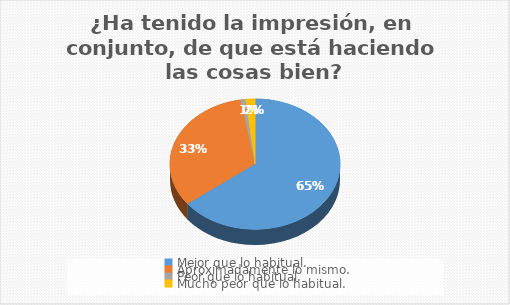
| Category | ¿Ha tenido la impresión, en conjunto, de que está haciendo las cosas bien? |
|---|---|
| Mejor que lo habitual. | 71 |
| Aproximadamente lo mismo. | 36 |
| Peor que lo habitual. | 1 |
| Mucho peor que lo habitual. | 2 |